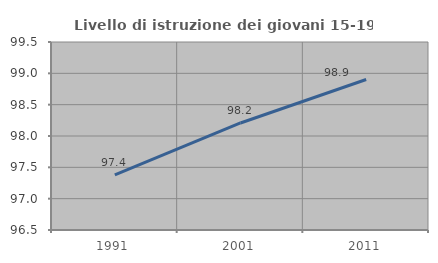
| Category | Livello di istruzione dei giovani 15-19 anni |
|---|---|
| 1991.0 | 97.381 |
| 2001.0 | 98.208 |
| 2011.0 | 98.901 |